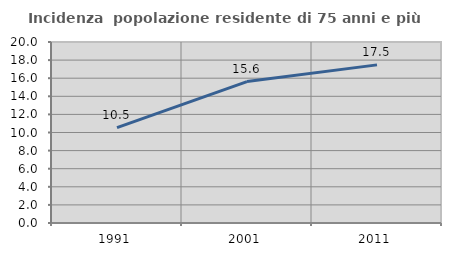
| Category | Incidenza  popolazione residente di 75 anni e più |
|---|---|
| 1991.0 | 10.543 |
| 2001.0 | 15.629 |
| 2011.0 | 17.471 |